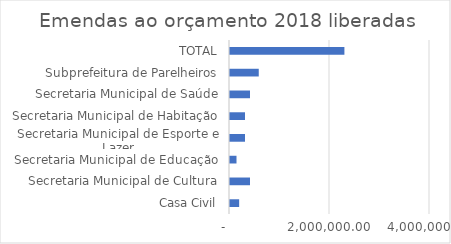
| Category | Series 0 |
|---|---|
| Casa Civil | 183181 |
| Secretaria Municipal de Cultura | 400000 |
| Secretaria Municipal de Educação | 130000 |
| Secretaria Municipal de Esporte e Lazer | 300000 |
| Secretaria Municipal de Habitação | 300000 |
| Secretaria Municipal de Saúde | 400000 |
| Subprefeitura de Parelheiros | 575000 |
| TOTAL | 2288181 |